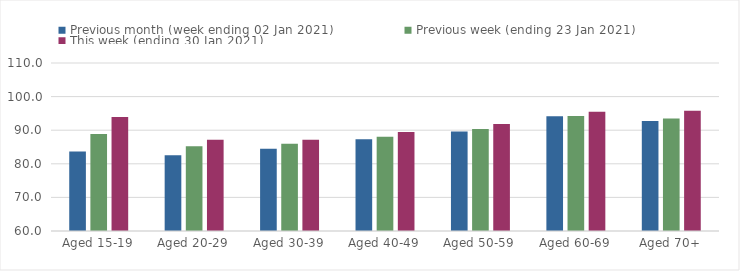
| Category | Previous month (week ending 02 Jan 2021) | Previous week (ending 23 Jan 2021) | This week (ending 30 Jan 2021) |
|---|---|---|---|
| Aged 15-19 | 83.68 | 88.87 | 93.9 |
| Aged 20-29 | 82.56 | 85.26 | 87.17 |
| Aged 30-39 | 84.51 | 85.97 | 87.19 |
| Aged 40-49 | 87.3 | 88.06 | 89.48 |
| Aged 50-59 | 89.58 | 90.34 | 91.86 |
| Aged 60-69 | 94.13 | 94.19 | 95.51 |
| Aged 70+ | 92.77 | 93.49 | 95.81 |